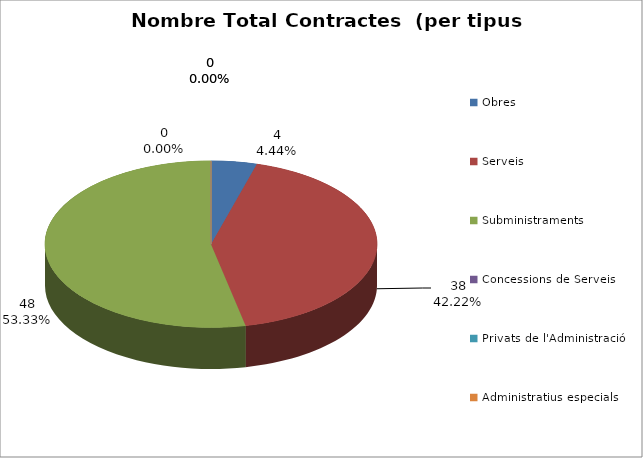
| Category | Nombre Total Contractes |
|---|---|
| Obres | 4 |
| Serveis | 38 |
| Subministraments | 48 |
| Concessions de Serveis | 0 |
| Privats de l'Administració | 0 |
| Administratius especials | 0 |